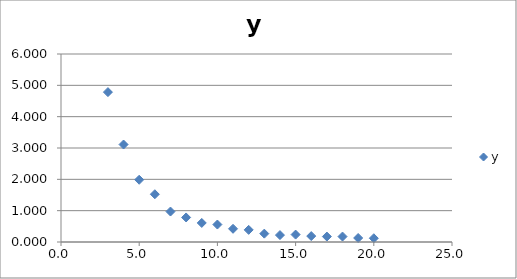
| Category | y |
|---|---|
| 3.0 | 4.783 |
| 4.0 | 3.111 |
| 5.0 | 1.986 |
| 6.0 | 1.524 |
| 7.0 | 0.972 |
| 8.0 | 0.783 |
| 9.0 | 0.608 |
| 10.0 | 0.558 |
| 11.0 | 0.421 |
| 12.0 | 0.387 |
| 13.0 | 0.267 |
| 14.0 | 0.221 |
| 15.0 | 0.236 |
| 16.0 | 0.189 |
| 17.0 | 0.173 |
| 18.0 | 0.174 |
| 19.0 | 0.128 |
| 20.0 | 0.12 |